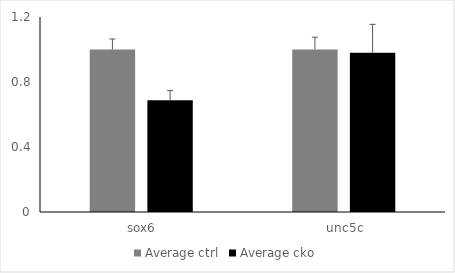
| Category | Average ctrl | Average cko |
|---|---|---|
|  sox6 | 1 | 0.687 |
|  unc5c | 1 | 0.98 |